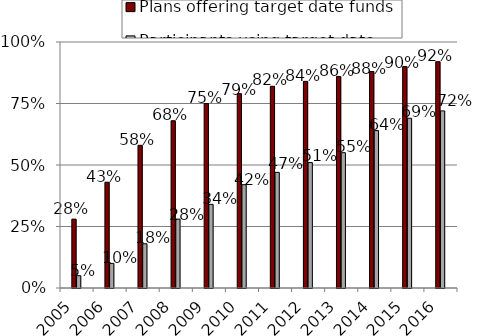
| Category | Plans offering target date funds | Participants using target date funds |
|---|---|---|
| 2005.0 | 0.28 | 0.05 |
| 2006.0 | 0.43 | 0.1 |
| 2007.0 | 0.58 | 0.18 |
| 2008.0 | 0.68 | 0.28 |
| 2009.0 | 0.75 | 0.34 |
| 2010.0 | 0.79 | 0.42 |
| 2011.0 | 0.82 | 0.47 |
| 2012.0 | 0.84 | 0.51 |
| 2013.0 | 0.86 | 0.55 |
| 2014.0 | 0.88 | 0.64 |
| 2015.0 | 0.9 | 0.69 |
| 2016.0 | 0.92 | 0.72 |